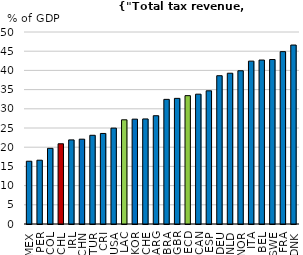
| Category | 2019 |
|---|---|
| MEX | 16.347 |
| PER | 16.614 |
| COL | 19.703 |
| CHL | 20.891 |
| IRL | 21.903 |
| CHN | 22.089 |
| TUR | 23.103 |
| CRI | 23.579 |
| USA | 24.969 |
| LAC | 27.133 |
| KOR | 27.305 |
| CHE | 27.358 |
| ARG | 28.194 |
| BRA | 32.457 |
| GBR | 32.718 |
| OECD | 33.423 |
| CAN | 33.808 |
| ESP | 34.682 |
| DEU | 38.617 |
| NLD | 39.264 |
| NOR | 39.906 |
| ITA | 42.415 |
| BEL | 42.7 |
| SWE | 42.833 |
| FRA | 44.885 |
| DNK | 46.603 |